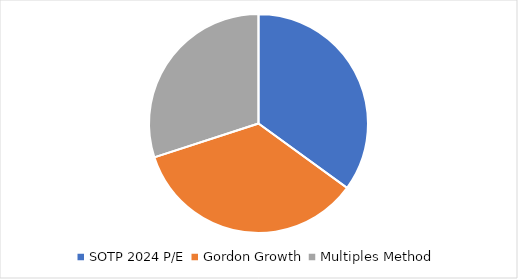
| Category | Series 0 |
|---|---|
| SOTP 2024 P/E | 0.35 |
| Gordon Growth | 0.35 |
| Multiples Method | 0.3 |